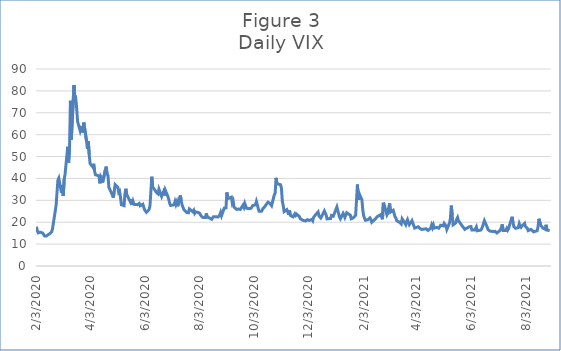
| Category | Series 0 |
|---|---|
| 2/3/20 | 17.97 |
| 2/4/20 | 16.05 |
| 2/5/20 | 15.15 |
| 2/6/20 | 14.96 |
| 2/7/20 | 15.47 |
| 2/10/20 | 15.04 |
| 2/11/20 | 15.18 |
| 2/12/20 | 13.74 |
| 2/13/20 | 14.15 |
| 2/14/20 | 13.68 |
| 2/18/20 | 14.83 |
| 2/19/20 | 14.38 |
| 2/20/20 | 15.56 |
| 2/21/20 | 17.08 |
| 2/24/20 | 25.03 |
| 2/25/20 | 27.85 |
| 2/26/20 | 27.56 |
| 2/27/20 | 39.16 |
| 2/28/20 | 40.11 |
| 3/2/20 | 33.42 |
| 3/3/20 | 36.82 |
| 3/4/20 | 31.99 |
| 3/5/20 | 39.62 |
| 3/6/20 | 41.94 |
| 3/9/20 | 54.46 |
| 3/10/20 | 47.3 |
| 3/11/20 | 53.9 |
| 3/12/20 | 75.47 |
| 3/13/20 | 57.83 |
| 3/16/20 | 82.69 |
| 3/17/20 | 75.91 |
| 3/18/20 | 76.45 |
| 3/19/20 | 72 |
| 3/20/20 | 66.04 |
| 3/23/20 | 61.59 |
| 3/24/20 | 61.67 |
| 3/25/20 | 63.95 |
| 3/26/20 | 61 |
| 3/27/20 | 65.54 |
| 3/30/20 | 57.08 |
| 3/31/20 | 53.54 |
| 4/1/20 | 57.06 |
| 4/2/20 | 50.91 |
| 4/3/20 | 46.8 |
| 4/6/20 | 45.24 |
| 4/7/20 | 46.7 |
| 4/8/20 | 43.35 |
| 4/9/20 | 41.67 |
| 4/13/20 | 41.17 |
| 4/14/20 | 37.76 |
| 4/15/20 | 40.84 |
| 4/16/20 | 40.11 |
| 4/17/20 | 38.15 |
| 4/20/20 | 43.83 |
| 4/21/20 | 45.41 |
| 4/22/20 | 41.98 |
| 4/23/20 | 41.38 |
| 4/24/20 | 35.93 |
| 4/27/20 | 33.29 |
| 4/28/20 | 33.57 |
| 4/29/20 | 31.23 |
| 4/30/20 | 34.15 |
| 5/1/20 | 37.19 |
| 5/4/20 | 35.97 |
| 5/5/20 | 33.61 |
| 5/6/20 | 34.12 |
| 5/7/20 | 31.44 |
| 5/8/20 | 27.98 |
| 5/11/20 | 27.57 |
| 5/12/20 | 33.04 |
| 5/13/20 | 35.28 |
| 5/14/20 | 32.61 |
| 5/15/20 | 31.89 |
| 5/18/20 | 29.3 |
| 5/19/20 | 30.53 |
| 5/20/20 | 27.99 |
| 5/21/20 | 29.53 |
| 5/22/20 | 28.16 |
| 5/26/20 | 28.01 |
| 5/27/20 | 27.62 |
| 5/28/20 | 28.59 |
| 5/29/20 | 27.51 |
| 6/1/20 | 28.23 |
| 6/2/20 | 26.84 |
| 6/3/20 | 25.66 |
| 6/4/20 | 25.81 |
| 6/5/20 | 24.52 |
| 6/8/20 | 25.81 |
| 6/9/20 | 27.57 |
| 6/10/20 | 27.57 |
| 6/11/20 | 40.79 |
| 6/12/20 | 36.09 |
| 6/15/20 | 34.4 |
| 6/16/20 | 33.67 |
| 6/17/20 | 33.47 |
| 6/18/20 | 32.94 |
| 6/19/20 | 35.12 |
| 6/22/20 | 31.77 |
| 6/23/20 | 31.37 |
| 6/24/20 | 33.84 |
| 6/25/20 | 32.22 |
| 6/26/20 | 34.73 |
| 6/29/20 | 31.78 |
| 6/30/20 | 30.43 |
| 7/1/20 | 28.62 |
| 7/2/20 | 27.68 |
| 7/6/20 | 27.94 |
| 7/7/20 | 29.43 |
| 7/8/20 | 28.08 |
| 7/9/20 | 29.26 |
| 7/10/20 | 27.29 |
| 7/13/20 | 32.19 |
| 7/14/20 | 29.52 |
| 7/15/20 | 27.76 |
| 7/16/20 | 28 |
| 7/17/20 | 25.68 |
| 7/20/20 | 24.46 |
| 7/21/20 | 24.84 |
| 7/22/20 | 24.32 |
| 7/23/20 | 26.08 |
| 7/24/20 | 25.84 |
| 7/27/20 | 24.74 |
| 7/28/20 | 25.44 |
| 7/29/20 | 24.1 |
| 7/30/20 | 24.76 |
| 7/31/20 | 24.46 |
| 8/3/20 | 24.28 |
| 8/4/20 | 23.76 |
| 8/5/20 | 22.99 |
| 8/6/20 | 22.65 |
| 8/7/20 | 22.21 |
| 8/10/20 | 22.13 |
| 8/11/20 | 24.03 |
| 8/12/20 | 22.28 |
| 8/13/20 | 22.13 |
| 8/14/20 | 22.05 |
| 8/17/20 | 21.35 |
| 8/18/20 | 21.51 |
| 8/19/20 | 22.54 |
| 8/20/20 | 22.72 |
| 8/21/20 | 22.54 |
| 8/24/20 | 22.37 |
| 8/25/20 | 22.03 |
| 8/26/20 | 23.27 |
| 8/27/20 | 24.47 |
| 8/28/20 | 22.96 |
| 8/31/20 | 26.41 |
| 9/1/20 | 26.12 |
| 9/2/20 | 26.57 |
| 9/3/20 | 33.6 |
| 9/4/20 | 30.75 |
| 9/8/20 | 31.46 |
| 9/9/20 | 28.81 |
| 9/10/20 | 29.71 |
| 9/11/20 | 26.87 |
| 9/14/20 | 25.85 |
| 9/15/20 | 25.59 |
| 9/16/20 | 26.04 |
| 9/17/20 | 26.46 |
| 9/18/20 | 25.83 |
| 9/21/20 | 27.78 |
| 9/22/20 | 26.86 |
| 9/23/20 | 28.58 |
| 9/24/20 | 28.51 |
| 9/25/20 | 26.38 |
| 9/28/20 | 26.19 |
| 9/29/20 | 26.27 |
| 9/30/20 | 26.37 |
| 10/1/20 | 26.7 |
| 10/2/20 | 27.63 |
| 10/5/20 | 27.96 |
| 10/6/20 | 29.48 |
| 10/7/20 | 28.06 |
| 10/8/20 | 26.36 |
| 10/9/20 | 25 |
| 10/12/20 | 25.07 |
| 10/13/20 | 26.07 |
| 10/14/20 | 26.4 |
| 10/15/20 | 26.97 |
| 10/16/20 | 27.41 |
| 10/19/20 | 29.18 |
| 10/20/20 | 29.35 |
| 10/21/20 | 28.65 |
| 10/22/20 | 28.11 |
| 10/23/20 | 27.55 |
| 10/26/20 | 32.46 |
| 10/27/20 | 33.35 |
| 10/28/20 | 40.28 |
| 10/29/20 | 37.59 |
| 10/30/20 | 38.02 |
| 11/2/20 | 37.13 |
| 11/3/20 | 35.55 |
| 11/4/20 | 29.57 |
| 11/5/20 | 27.58 |
| 11/6/20 | 24.86 |
| 11/9/20 | 25.75 |
| 11/10/20 | 24.8 |
| 11/11/20 | 23.45 |
| 11/12/20 | 25.35 |
| 11/13/20 | 23.1 |
| 11/16/20 | 22.45 |
| 11/17/20 | 22.71 |
| 11/18/20 | 23.84 |
| 11/19/20 | 23.11 |
| 11/20/20 | 23.7 |
| 11/23/20 | 22.66 |
| 11/24/20 | 21.64 |
| 11/25/20 | 21.25 |
| 11/27/20 | 20.84 |
| 11/30/20 | 20.57 |
| 12/1/20 | 20.77 |
| 12/2/20 | 21.17 |
| 12/3/20 | 21.28 |
| 12/4/20 | 20.79 |
| 12/7/20 | 21.3 |
| 12/8/20 | 20.68 |
| 12/9/20 | 22.27 |
| 12/10/20 | 22.52 |
| 12/11/20 | 23.31 |
| 12/14/20 | 24.72 |
| 12/15/20 | 22.89 |
| 12/16/20 | 22.5 |
| 12/17/20 | 21.93 |
| 12/18/20 | 21.57 |
| 12/21/20 | 25.16 |
| 12/22/20 | 24.23 |
| 12/23/20 | 23.31 |
| 12/24/20 | 21.53 |
| 12/28/20 | 21.7 |
| 12/29/20 | 23.08 |
| 12/30/20 | 22.77 |
| 12/31/20 | 22.75 |
| 1/4/21 | 26.97 |
| 1/5/21 | 25.34 |
| 1/6/21 | 25.07 |
| 1/7/21 | 22.37 |
| 1/8/21 | 21.56 |
| 1/11/21 | 24.08 |
| 1/12/21 | 23.33 |
| 1/13/21 | 22.21 |
| 1/14/21 | 23.25 |
| 1/15/21 | 24.34 |
| 1/19/21 | 23.24 |
| 1/20/21 | 21.58 |
| 1/21/21 | 21.32 |
| 1/22/21 | 21.91 |
| 1/25/21 | 23.19 |
| 1/26/21 | 23.02 |
| 1/27/21 | 37.21 |
| 1/28/21 | 30.21 |
| 1/29/21 | 33.09 |
| 2/1/21 | 30.24 |
| 2/2/21 | 25.56 |
| 2/3/21 | 22.91 |
| 2/4/21 | 21.77 |
| 2/5/21 | 20.87 |
| 2/8/21 | 21.24 |
| 2/9/21 | 21.63 |
| 2/10/21 | 21.99 |
| 2/11/21 | 21.25 |
| 2/12/21 | 19.97 |
| 2/16/21 | 21.46 |
| 2/17/21 | 21.5 |
| 2/18/21 | 22.49 |
| 2/19/21 | 22.05 |
| 2/22/21 | 23.45 |
| 2/23/21 | 23.11 |
| 2/24/21 | 21.34 |
| 2/25/21 | 28.89 |
| 2/26/21 | 27.95 |
| 3/1/21 | 23.35 |
| 3/2/21 | 24.1 |
| 3/3/21 | 26.67 |
| 3/4/21 | 28.57 |
| 3/5/21 | 24.66 |
| 3/8/21 | 25.47 |
| 3/9/21 | 24.03 |
| 3/10/21 | 22.56 |
| 3/11/21 | 21.91 |
| 3/12/21 | 20.69 |
| 3/15/21 | 20.03 |
| 3/16/21 | 19.79 |
| 3/17/21 | 19.23 |
| 3/18/21 | 21.58 |
| 3/19/21 | 20.95 |
| 3/22/21 | 18.88 |
| 3/23/21 | 20.3 |
| 3/24/21 | 21.2 |
| 3/25/21 | 19.81 |
| 3/26/21 | 18.86 |
| 3/29/21 | 20.74 |
| 3/30/21 | 19.61 |
| 3/31/21 | 19.4 |
| 4/1/21 | 17.33 |
| 4/5/21 | 17.91 |
| 4/6/21 | 18.12 |
| 4/7/21 | 17.16 |
| 4/8/21 | 16.95 |
| 4/9/21 | 16.69 |
| 4/12/21 | 16.91 |
| 4/13/21 | 16.65 |
| 4/14/21 | 16.99 |
| 4/15/21 | 16.57 |
| 4/16/21 | 16.25 |
| 4/19/21 | 17.29 |
| 4/20/21 | 18.68 |
| 4/21/21 | 17.5 |
| 4/22/21 | 18.71 |
| 4/23/21 | 17.33 |
| 4/26/21 | 17.64 |
| 4/27/21 | 17.56 |
| 4/28/21 | 17.28 |
| 4/29/21 | 17.61 |
| 4/30/21 | 18.61 |
| 5/3/21 | 18.31 |
| 5/4/21 | 19.48 |
| 5/5/21 | 19.15 |
| 5/6/21 | 18.39 |
| 5/7/21 | 16.69 |
| 5/10/21 | 19.66 |
| 5/11/21 | 21.84 |
| 5/12/21 | 27.59 |
| 5/13/21 | 23.13 |
| 5/14/21 | 18.81 |
| 5/17/21 | 19.72 |
| 5/18/21 | 21.34 |
| 5/19/21 | 22.18 |
| 5/20/21 | 20.67 |
| 5/21/21 | 20.15 |
| 5/24/21 | 18.4 |
| 5/25/21 | 18.84 |
| 5/26/21 | 17.36 |
| 5/27/21 | 16.74 |
| 5/28/21 | 16.76 |
| 6/1/21 | 17.9 |
| 6/2/21 | 17.48 |
| 6/3/21 | 18.04 |
| 6/4/21 | 16.42 |
| 6/7/21 | 16.42 |
| 6/8/21 | 17.07 |
| 6/9/21 | 17.89 |
| 6/10/21 | 16.1 |
| 6/11/21 | 15.65 |
| 6/14/21 | 16.39 |
| 6/15/21 | 17.02 |
| 6/16/21 | 18.15 |
| 6/17/21 | 17.75 |
| 6/18/21 | 20.7 |
| 6/21/21 | 17.89 |
| 6/22/21 | 16.66 |
| 6/23/21 | 16.32 |
| 6/24/21 | 15.97 |
| 6/25/21 | 15.62 |
| 6/28/21 | 15.76 |
| 6/29/21 | 16.02 |
| 6/30/21 | 15.83 |
| 7/1/21 | 15.48 |
| 7/2/21 | 15.07 |
| 7/6/21 | 16.44 |
| 7/7/21 | 16.2 |
| 7/8/21 | 19 |
| 7/9/21 | 16.18 |
| 7/12/21 | 16.17 |
| 7/13/21 | 17.12 |
| 7/14/21 | 16.33 |
| 7/15/21 | 17.01 |
| 7/16/21 | 18.45 |
| 7/19/21 | 22.5 |
| 7/20/21 | 19.73 |
| 7/21/21 | 17.91 |
| 7/22/21 | 17.69 |
| 7/23/21 | 17.2 |
| 7/26/21 | 17.58 |
| 7/27/21 | 19.36 |
| 7/28/21 | 18.31 |
| 7/29/21 | 17.7 |
| 7/30/21 | 18.24 |
| 8/2/21 | 19.46 |
| 8/3/21 | 18.04 |
| 8/4/21 | 17.97 |
| 8/5/21 | 17.28 |
| 8/6/21 | 16.15 |
| 8/9/21 | 16.72 |
| 8/10/21 | 16.79 |
| 8/11/21 | 16.06 |
| 8/12/21 | 15.59 |
| 8/13/21 | 15.45 |
| 8/16/21 | 16.12 |
| 8/17/21 | 17.91 |
| 8/18/21 | 21.57 |
| 8/19/21 | 21.67 |
| 8/20/21 | 18.56 |
| 8/23/21 | 17.15 |
| 8/24/21 | 17.22 |
| 8/25/21 | 16.79 |
| 8/26/21 | 18.84 |
| 8/27/21 | 16.39 |
| 8/30/21 | 16.19 |
| 8/31/21 | 16.48 |